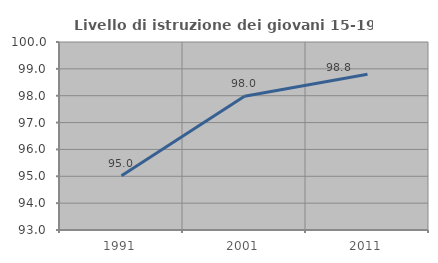
| Category | Livello di istruzione dei giovani 15-19 anni |
|---|---|
| 1991.0 | 95.019 |
| 2001.0 | 97.98 |
| 2011.0 | 98.802 |